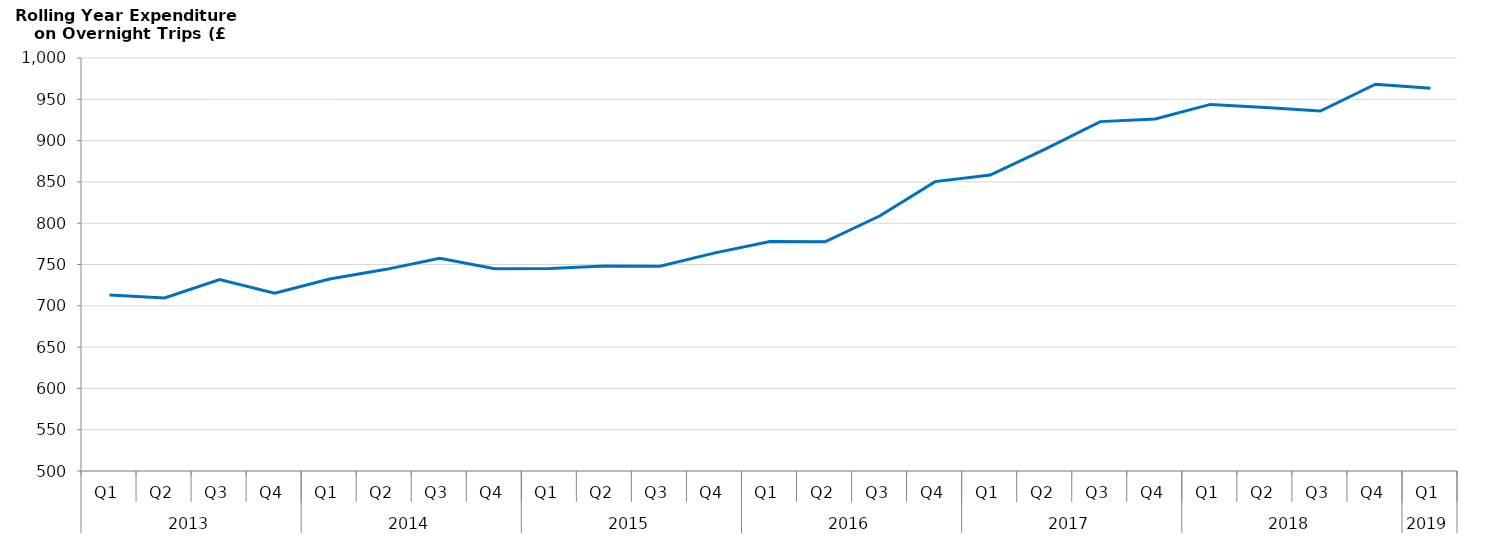
| Category | Rolling Year Expenditure during Overnight Trips (£) |
|---|---|
| 0 | 712983579.382 |
| 1 | 709441918.473 |
| 2 | 731788868.702 |
| 3 | 715190933.753 |
| 4 | 732440715.999 |
| 5 | 743830056.838 |
| 6 | 757659736.92 |
| 7 | 744902295.731 |
| 8 | 745261550.624 |
| 9 | 748317146.573 |
| 10 | 747907058.216 |
| 11 | 764066271.956 |
| 12 | 777939680.598 |
| 13 | 777438191.634 |
| 14 | 808977024.09 |
| 15 | 850358144.473 |
| 16 | 858344295.243 |
| 17 | 889665067.25 |
| 18 | 922986253.014 |
| 19 | 926129203.44 |
| 20 | 943804420.305 |
| 21 | 940131221.143 |
| 22 | 935735499.902 |
| 23 | 968252291.45 |
| 24 | 963382850.735 |